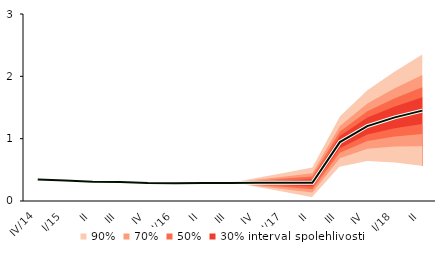
| Category | linka | Centerline |
|---|---|---|
| IV/14 | 0.344 | 0.344 |
| I/15 | 0.328 | 0.328 |
| II | 0.31 | 0.31 |
| III | 0.306 | 0.306 |
| IV | 0.29 | 0.29 |
| I/16 | 0.286 | 0.286 |
| II | 0.29 | 0.29 |
| III | 0.29 | 0.29 |
| IV | 0.291 | 0.291 |
| I/17 | 0.291 | 0.291 |
| II | 0.291 | 0.291 |
| III | 0.945 | 0.945 |
| IV | 1.202 | 1.202 |
| I/18 | 1.341 | 1.341 |
| II | 1.45 | 1.45 |